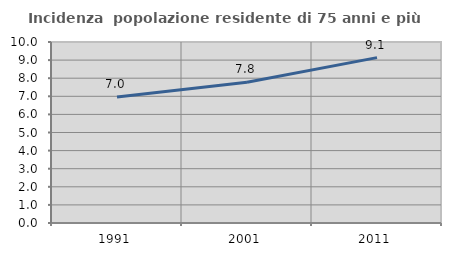
| Category | Incidenza  popolazione residente di 75 anni e più |
|---|---|
| 1991.0 | 6.963 |
| 2001.0 | 7.772 |
| 2011.0 | 9.136 |